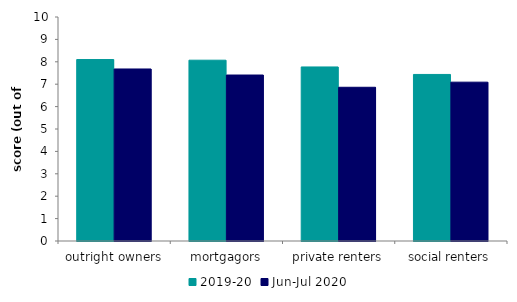
| Category | 2019-20 | Jun-Jul 2020 |
|---|---|---|
| outright owners | 8.101 | 7.679 |
| mortgagors | 8.072 | 7.41 |
| private renters | 7.77 | 6.863 |
| social renters | 7.435 | 7.091 |